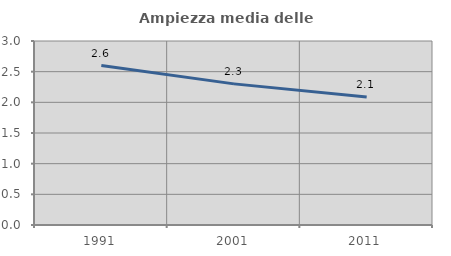
| Category | Ampiezza media delle famiglie |
|---|---|
| 1991.0 | 2.599 |
| 2001.0 | 2.301 |
| 2011.0 | 2.087 |